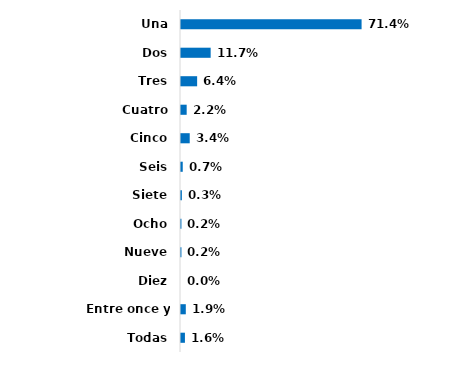
| Category | Series 0 |
|---|---|
| Una | 0.714 |
| Dos | 0.117 |
| Tres | 0.064 |
| Cuatro | 0.022 |
| Cinco | 0.034 |
| Seis | 0.007 |
| Siete | 0.003 |
| Ocho | 0.002 |
| Nueve | 0.002 |
| Diez | 0 |
| Entre once y veinte | 0.019 |
| Todas | 0.016 |